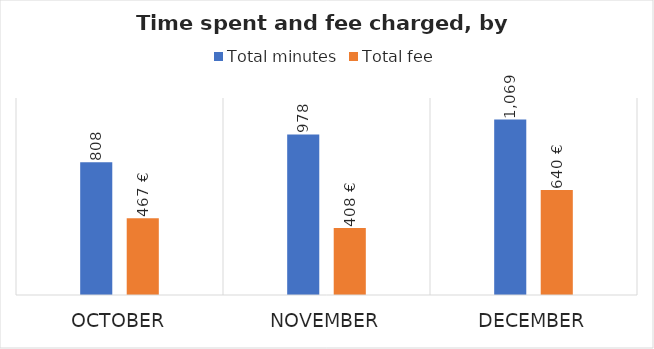
| Category | Total minutes | Total fee |
|---|---|---|
| October | 808 | 467 |
| November | 978 | 407.5 |
| December | 1069 | 639.5 |